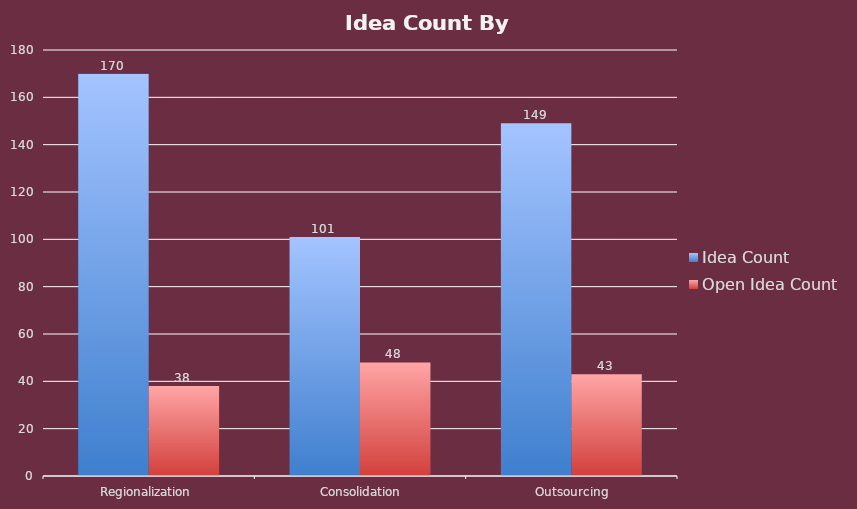
| Category | Idea Count | Open Idea Count |
|---|---|---|
| Regionalization, Consolidation, Outsourcing | 170 | 38 |
| Personnel, Compensation, Benefits, Retirement | 101 | 48 |
| Services, Finance, Revenue | 149 | 43 |